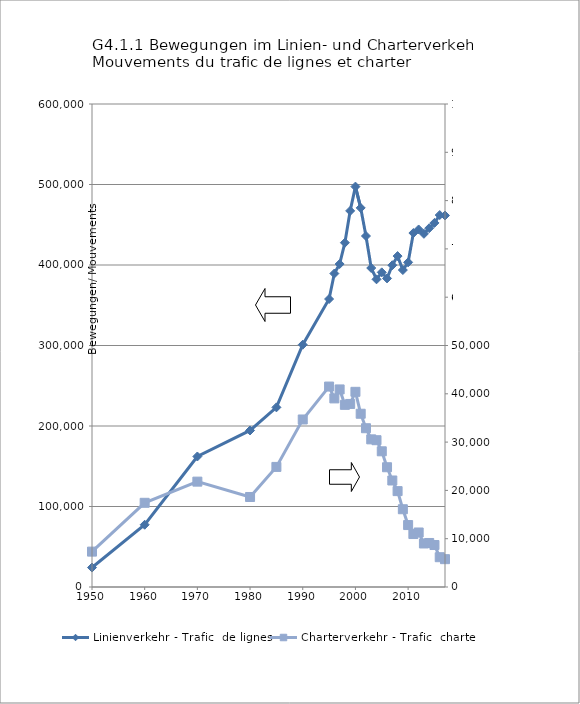
| Category | Linienverkehr - Trafic  de lignes |
|---|---|
| 1950.0 | 24166 |
| 1960.0 | 77337 |
| 1970.0 | 162118 |
| 1980.0 | 194463 |
| 1985.0 | 223154 |
| 1990.0 | 301006 |
| 1995.0 | 357731 |
| 1996.0 | 389383 |
| 1997.0 | 401195 |
| 1998.0 | 427694 |
| 1999.0 | 467220 |
| 2000.0 | 497403 |
| 2001.0 | 470947 |
| 2002.0 | 436018 |
| 2003.0 | 396268 |
| 2004.0 | 382229 |
| 2005.0 | 390862 |
| 2006.0 | 383343 |
| 2007.0 | 399730 |
| 2008.0 | 411090 |
| 2009.0 | 393747 |
| 2010.0 | 403286 |
| 2011.0 | 439725 |
| 2012.0 | 444138 |
| 2013.0 | 438725 |
| 2014.0 | 445723 |
| 2015.0 | 452286 |
| 2016.0 | 462059 |
| 2017.0 | 461501 |